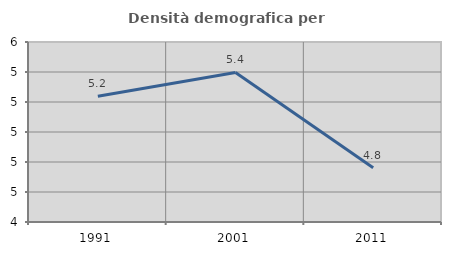
| Category | Densità demografica |
|---|---|
| 1991.0 | 5.238 |
| 2001.0 | 5.397 |
| 2011.0 | 4.762 |